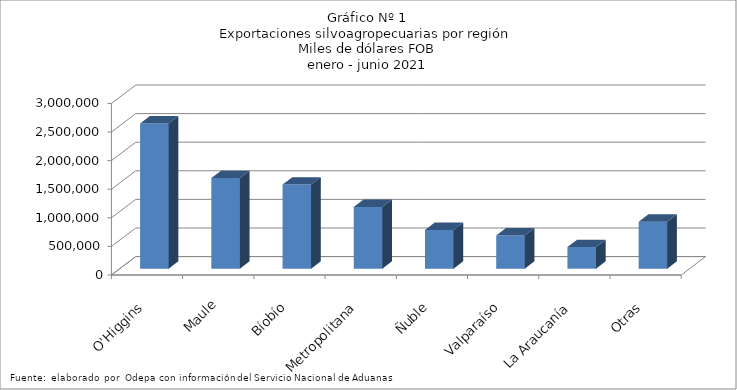
| Category | Series 0 |
|---|---|
| O'Higgins | 2539200.246 |
| Maule | 1585691.555 |
| Bíobío | 1470052.178 |
| Metropolitana | 1079283.645 |
| Ñuble | 677714.155 |
| Valparaíso | 580630.048 |
| La Araucanía | 378682.717 |
| Otras | 821934.085 |